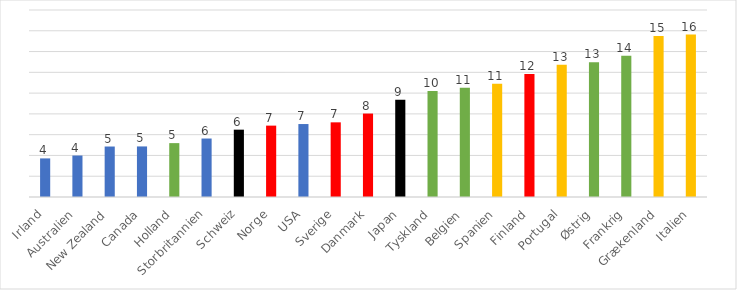
| Category | Series 0 |
|---|---|
| Irland | 3.715 |
| Australien | 3.993 |
| New Zealand | 4.859 |
| Canada | 4.868 |
| Holland | 5.186 |
| Storbritannien | 5.629 |
| Schweiz | 6.481 |
| Norge | 6.87 |
| USA | 7.023 |
| Sverige | 7.186 |
| Danmark | 8.031 |
| Japan | 9.358 |
| Tyskland | 10.202 |
| Belgien | 10.51 |
| Spanien | 10.903 |
| Finland | 11.844 |
| Portugal | 12.729 |
| Østrig | 12.975 |
| Frankrig | 13.596 |
| Grækenland | 15.488 |
| Italien | 15.64 |